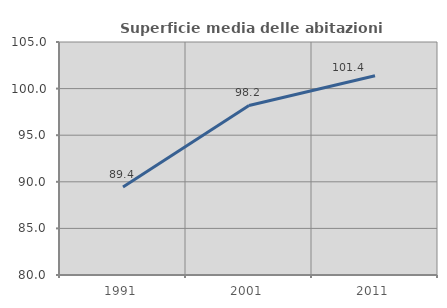
| Category | Superficie media delle abitazioni occupate |
|---|---|
| 1991.0 | 89.443 |
| 2001.0 | 98.191 |
| 2011.0 | 101.377 |